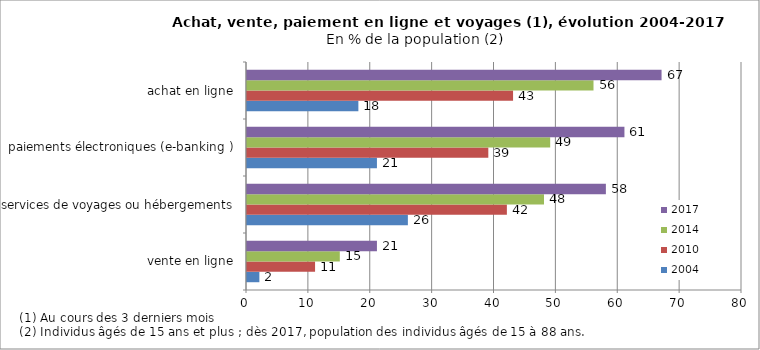
| Category | 2004 | 2010 | 2014 | 2017 |
|---|---|---|---|---|
| vente en ligne | 2 | 11 | 15 | 21 |
| services de voyages ou hébergements | 26 | 42 | 48 | 58 |
| paiements électroniques (e-banking ) | 21 | 39 | 49 | 61 |
| achat en ligne | 18 | 43 | 56 | 67 |